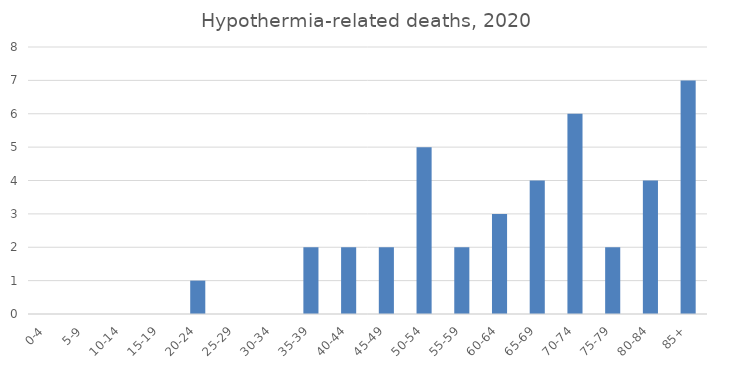
| Category | Series 0 |
|---|---|
| 0-4 | 0 |
| 5-9 | 0 |
| 10-14 | 0 |
| 15-19 | 0 |
| 20-24 | 1 |
| 25-29 | 0 |
| 30-34 | 0 |
| 35-39 | 2 |
| 40-44 | 2 |
| 45-49 | 2 |
| 50-54 | 5 |
| 55-59 | 2 |
| 60-64 | 3 |
| 65-69 | 4 |
| 70-74 | 6 |
| 75-79 | 2 |
| 80-84 | 4 |
| 85+ | 7 |